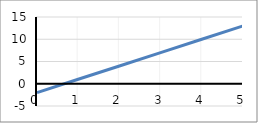
| Category | y |
|---|---|
| 0.0 | -2 |
| 1.0 | 1 |
| 2.0 | 4 |
| 3.0 | 7 |
| 4.0 | 10 |
| 5.0 | 13 |